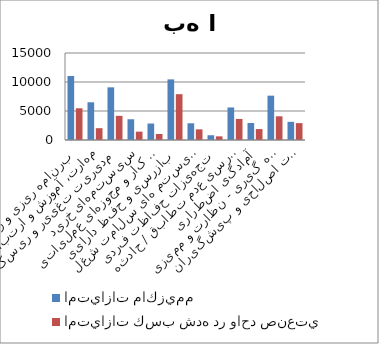
| Category | امتيازات ماكزيمم | امتيازات كسب شده در واحد صنعتي |
|---|---|---|
| برنامه ریزی و رهبری | 11040 | 5469 |
| مهارت، آموزش و ارتباطات | 6505 | 2035 |
| مدیریت تغییر و ریسک | 9080 | 4165 |
| سیستمهای خرید | 3575 | 1440 |
| قوانین کار و مجوزهای عملیاتی | 2840 | 1030 |
| بازرسی و حفظ دارایی | 10450 | 7900 |
| سیستم های سلامت شغلی | 2880 | 1835 |
| تجهیزات حفاظت فردی | 820 | 630 |
| گزارش و بررسی عدم تطابق / حادثه | 5610 | 3630 |
| آمادگی اضطراری | 2930 | 1881 |
| اندازه گیری - نظارت و ممیزی | 7645 | 4085 |
| سیستم اقدامات اصلاحی و پیشگیرانه | 3130 | 2910 |